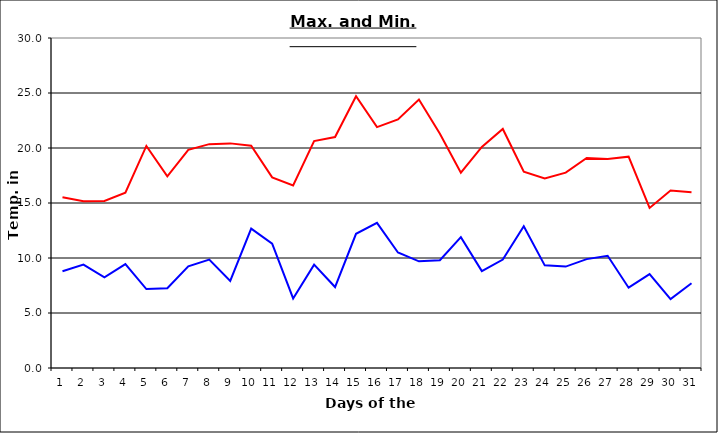
| Category | Series 0 | Series 1 |
|---|---|---|
| 0 | 15.52 | 8.79 |
| 1 | 15.15 | 9.4 |
| 2 | 15.18 | 8.24 |
| 3 | 15.93 | 9.45 |
| 4 | 20.19 | 7.18 |
| 5 | 17.42 | 7.25 |
| 6 | 19.84 | 9.25 |
| 7 | 20.35 | 9.86 |
| 8 | 20.42 | 7.92 |
| 9 | 20.21 | 12.67 |
| 10 | 17.33 | 11.31 |
| 11 | 16.6 | 6.32 |
| 12 | 20.63 | 9.4 |
| 13 | 21 | 7.36 |
| 14 | 24.7 | 12.2 |
| 15 | 21.9 | 13.2 |
| 16 | 22.6 | 10.5 |
| 17 | 24.4 | 9.7 |
| 18 | 21.3 | 9.8 |
| 19 | 17.76 | 11.9 |
| 20 | 20.1 | 8.81 |
| 21 | 21.73 | 9.86 |
| 22 | 17.84 | 12.89 |
| 23 | 17.23 | 9.33 |
| 24 | 17.76 | 9.22 |
| 25 | 19.09 | 9.9 |
| 26 | 19.01 | 10.2 |
| 27 | 19.21 | 7.3 |
| 28 | 14.55 | 8.54 |
| 29 | 16.13 | 6.27 |
| 30 | 15.97 | 7.71 |